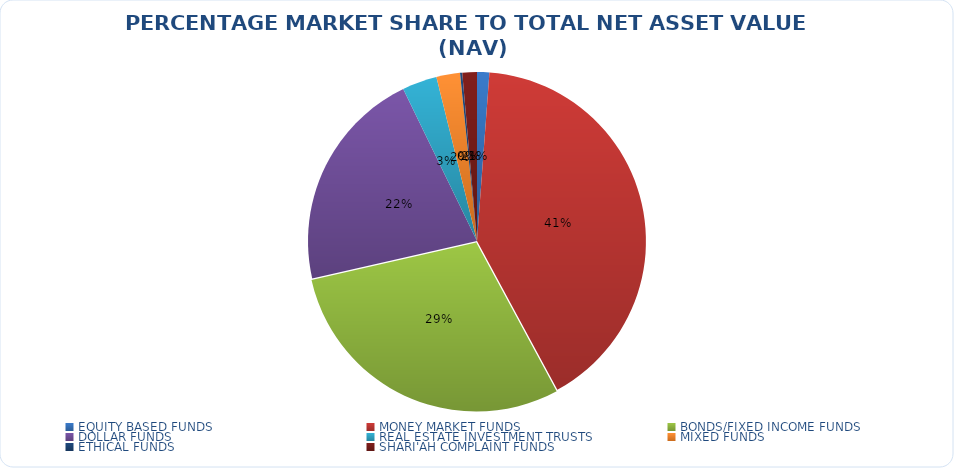
| Category | NET ASSET VALUE |
|---|---|
| EQUITY BASED FUNDS | 16084364796.91 |
| MONEY MARKET FUNDS | 560569590192.584 |
| BONDS/FIXED INCOME FUNDS | 401656430180.65 |
| DOLLAR FUNDS | 292530418732.276 |
| REAL ESTATE INVESTMENT TRUSTS | 45545162423.9 |
| MIXED FUNDS | 30940700501.965 |
| ETHICAL FUNDS | 2915757687.58 |
| SHARI'AH COMPLAINT FUNDS | 19051145897.05 |